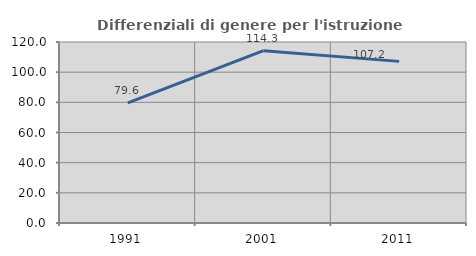
| Category | Differenziali di genere per l'istruzione superiore |
|---|---|
| 1991.0 | 79.645 |
| 2001.0 | 114.25 |
| 2011.0 | 107.152 |